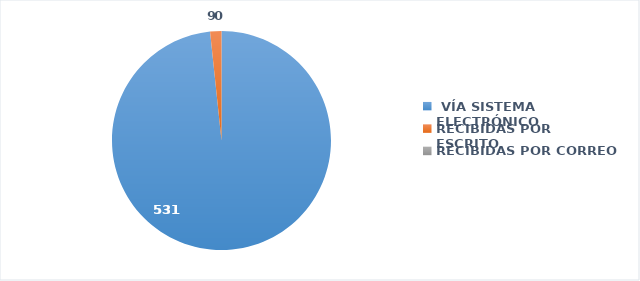
| Category | SOLICITUDES RECIBIDAS |
|---|---|
|  VÍA SISTEMA ELECTRÓNICO | 531 |
| RECIBIDAS POR ESCRITO | 9 |
| RECIBIDAS POR CORREO | 0 |